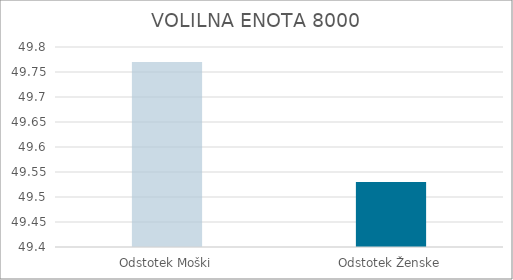
| Category | Series 0 |
|---|---|
| Odstotek Moški | 49.77 |
| Odstotek Ženske | 49.53 |